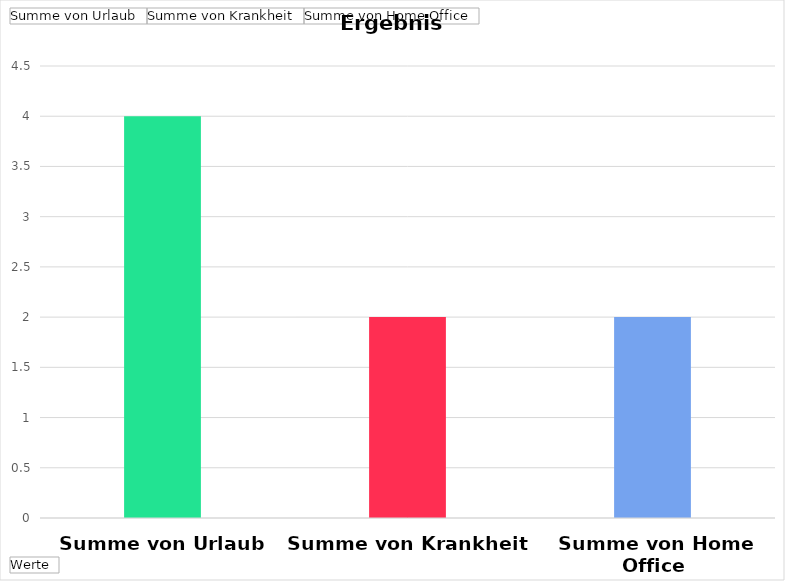
| Category | Ergebnis |
|---|---|
| Summe von Urlaub | 4 |
| Summe von Krankheit | 2 |
| Summe von Home Office | 2 |